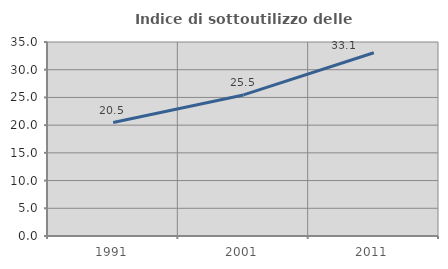
| Category | Indice di sottoutilizzo delle abitazioni  |
|---|---|
| 1991.0 | 20.475 |
| 2001.0 | 25.451 |
| 2011.0 | 33.07 |